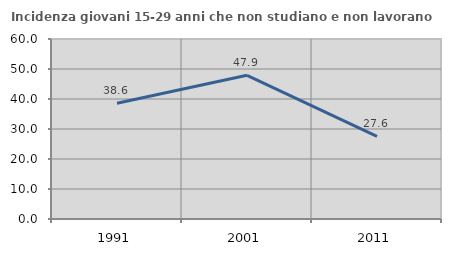
| Category | Incidenza giovani 15-29 anni che non studiano e non lavorano  |
|---|---|
| 1991.0 | 38.61 |
| 2001.0 | 47.904 |
| 2011.0 | 27.556 |